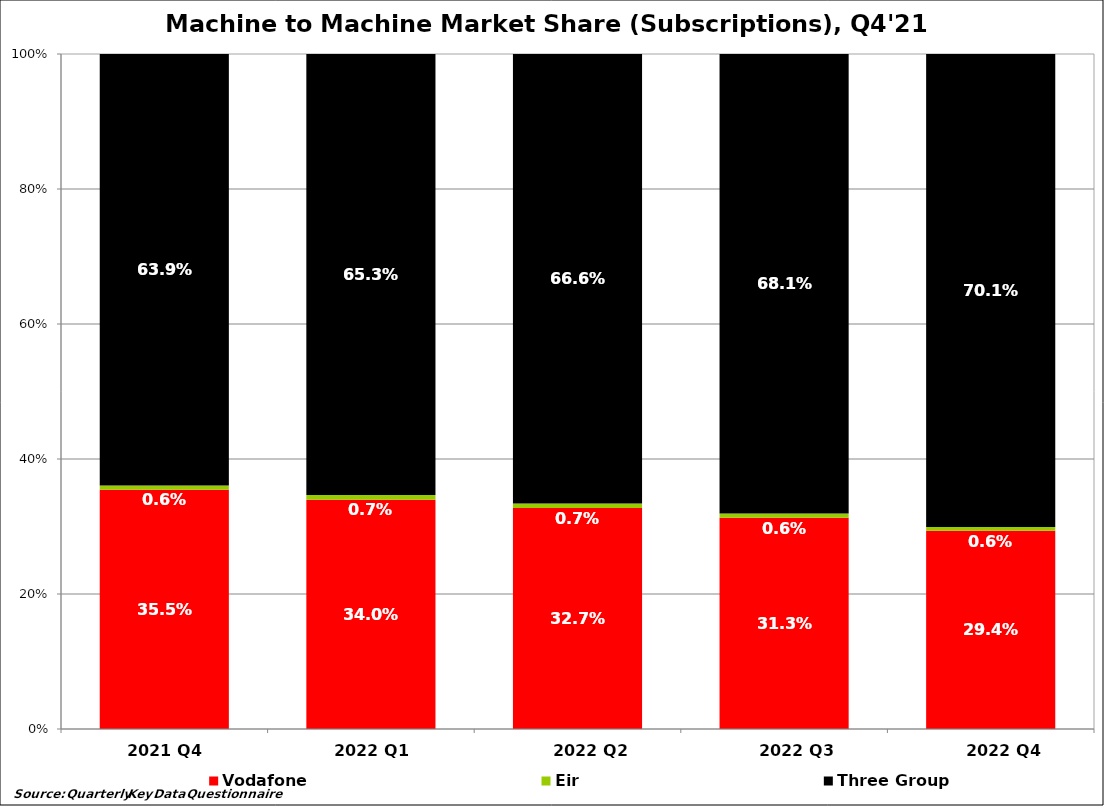
| Category | Vodafone | Eir  | Three Group |
|---|---|---|---|
| 2021 Q4  | 0.355 | 0.006 | 0.639 |
| 2022 Q1  | 0.34 | 0.007 | 0.653 |
| 2022 Q2 | 0.327 | 0.007 | 0.666 |
| 2022 Q3 | 0.313 | 0.006 | 0.681 |
| 2022 Q4 | 0.294 | 0.006 | 0.701 |